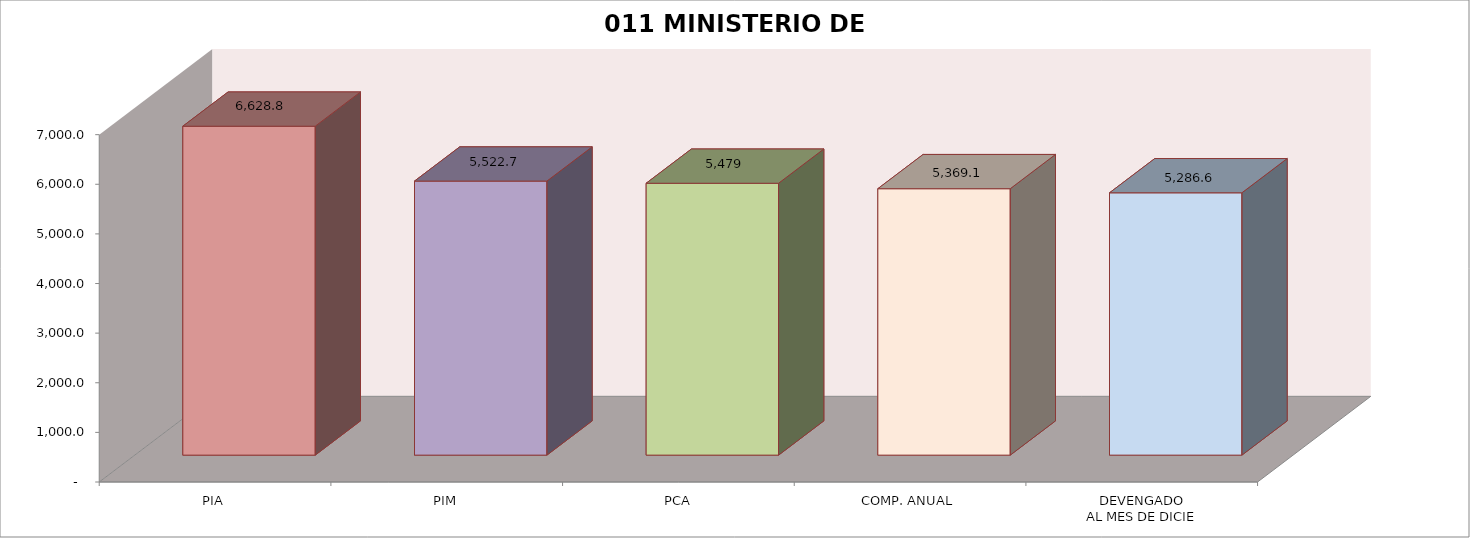
| Category | 011 MINISTERIO DE SALUD |
|---|---|
| PIA | 6628.781 |
| PIM | 5522.719 |
| PCA | 5479.039 |
| COMP. ANUAL | 5369.114 |
| DEVENGADO
AL MES DE DICIE | 5286.611 |